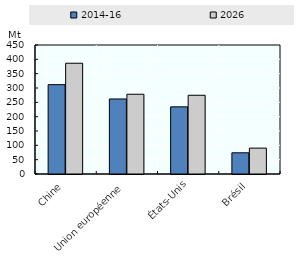
| Category | 2014-16 | 2026 |
|---|---|---|
| Chine | 311.635 | 386.357 |
| Union européenne | 261.784 | 278.202 |
| États-Unis | 234.261 | 274.609 |
| Brésil | 73.994 | 90.237 |